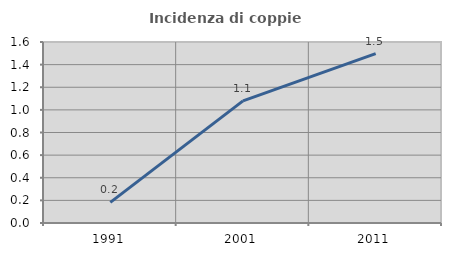
| Category | Incidenza di coppie miste |
|---|---|
| 1991.0 | 0.183 |
| 2001.0 | 1.079 |
| 2011.0 | 1.497 |